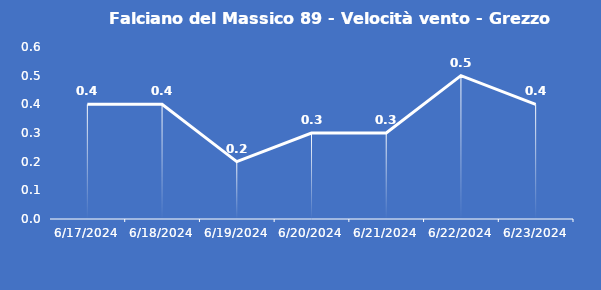
| Category | Falciano del Massico 89 - Velocità vento - Grezzo (m/s) |
|---|---|
| 6/17/24 | 0.4 |
| 6/18/24 | 0.4 |
| 6/19/24 | 0.2 |
| 6/20/24 | 0.3 |
| 6/21/24 | 0.3 |
| 6/22/24 | 0.5 |
| 6/23/24 | 0.4 |